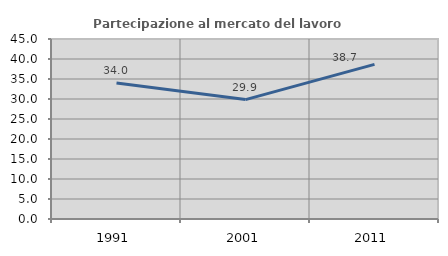
| Category | Partecipazione al mercato del lavoro  femminile |
|---|---|
| 1991.0 | 34.028 |
| 2001.0 | 29.851 |
| 2011.0 | 38.655 |